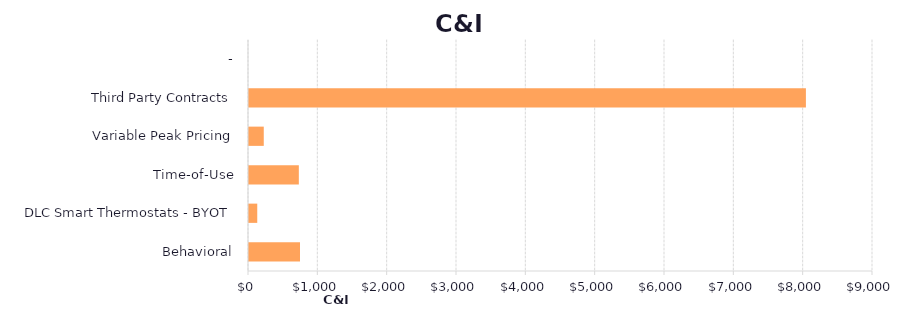
| Category | Series 1 |
|---|---|
| Behavioral | 735.599 |
| DLC Smart Thermostats - BYOT | 119.032 |
| Time-of-Use | 718.77 |
| Variable Peak Pricing | 212.987 |
| Third Party Contracts | 8032.322 |
| - | 0 |